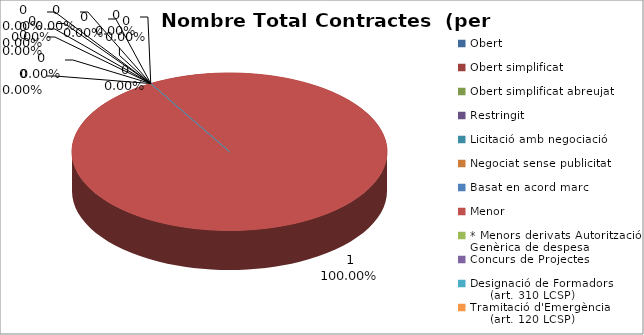
| Category | Nombre Total Contractes |
|---|---|
| Obert | 0 |
| Obert simplificat | 0 |
| Obert simplificat abreujat | 0 |
| Restringit | 0 |
| Licitació amb negociació | 0 |
| Negociat sense publicitat | 0 |
| Basat en acord marc | 0 |
| Menor | 1 |
| * Menors derivats Autorització Genèrica de despesa | 0 |
| Concurs de Projectes | 0 |
| Designació de Formadors
     (art. 310 LCSP) | 0 |
| Tramitació d'Emergència
     (art. 120 LCSP) | 0 |